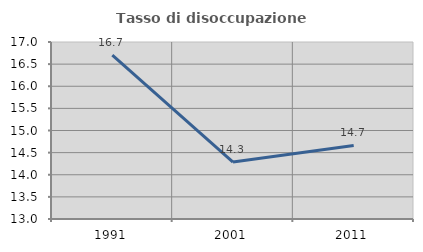
| Category | Tasso di disoccupazione giovanile  |
|---|---|
| 1991.0 | 16.703 |
| 2001.0 | 14.286 |
| 2011.0 | 14.662 |